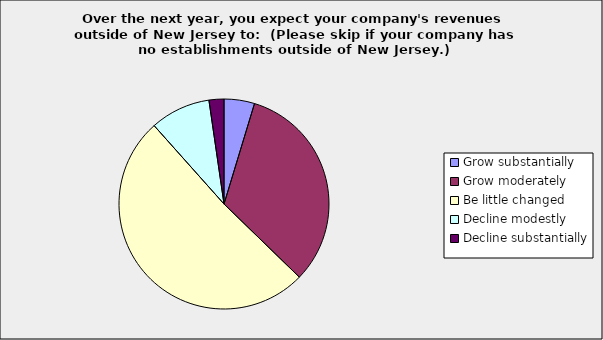
| Category | Series 0 |
|---|---|
| Grow substantially | 0.047 |
| Grow moderately | 0.326 |
| Be little changed | 0.512 |
| Decline modestly | 0.093 |
| Decline substantially | 0.023 |